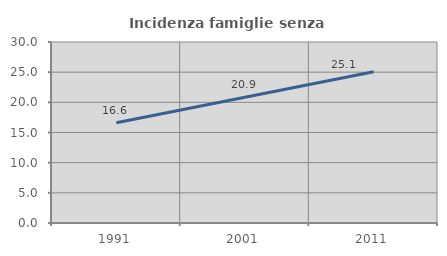
| Category | Incidenza famiglie senza nuclei |
|---|---|
| 1991.0 | 16.617 |
| 2001.0 | 20.856 |
| 2011.0 | 25.066 |